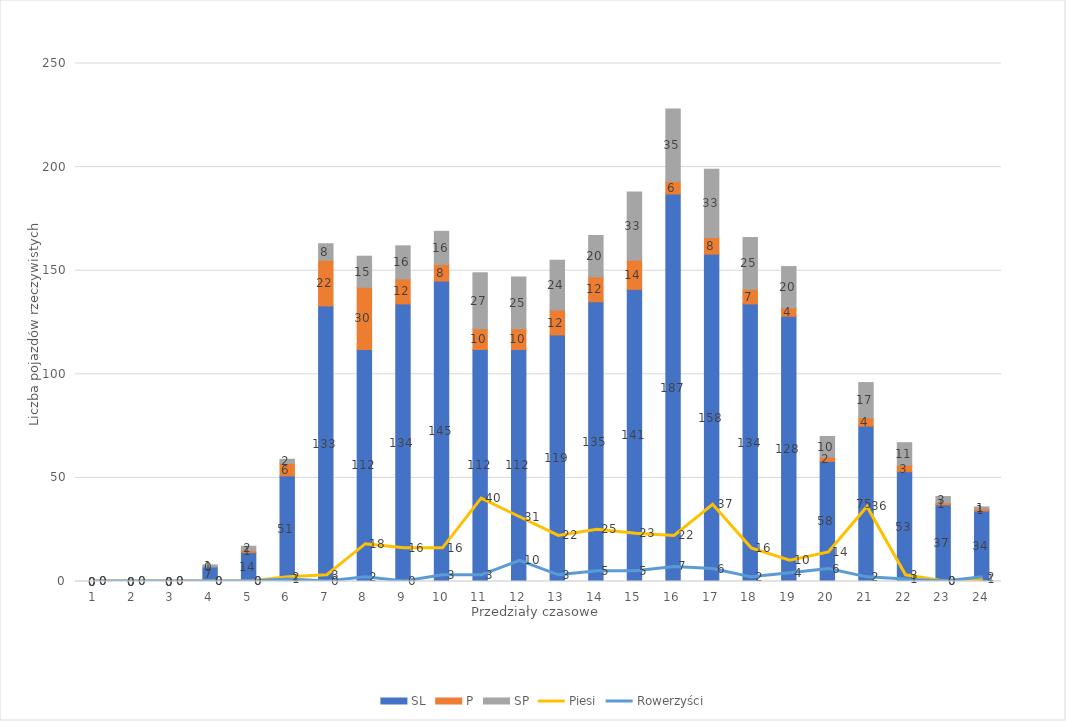
| Category | SL | P | SP |
|---|---|---|---|
| 0 | 0 | 0 | 0 |
| 1 | 0 | 0 | 0 |
| 2 | 0 | 0 | 0 |
| 3 | 7 | 0 | 1 |
| 4 | 14 | 1 | 2 |
| 5 | 51 | 6 | 2 |
| 6 | 133 | 22 | 8 |
| 7 | 112 | 30 | 15 |
| 8 | 134 | 12 | 16 |
| 9 | 145 | 8 | 16 |
| 10 | 112 | 10 | 27 |
| 11 | 112 | 10 | 25 |
| 12 | 119 | 12 | 24 |
| 13 | 135 | 12 | 20 |
| 14 | 141 | 14 | 33 |
| 15 | 187 | 6 | 35 |
| 16 | 158 | 8 | 33 |
| 17 | 134 | 7 | 25 |
| 18 | 128 | 4 | 20 |
| 19 | 58 | 2 | 10 |
| 20 | 75 | 4 | 17 |
| 21 | 53 | 3 | 11 |
| 22 | 37 | 1 | 3 |
| 23 | 34 | 1 | 1 |